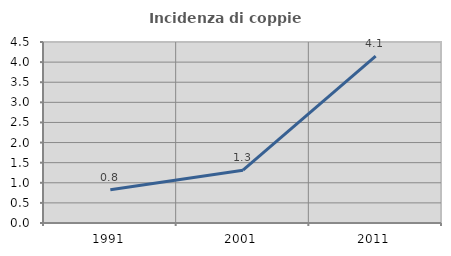
| Category | Incidenza di coppie miste |
|---|---|
| 1991.0 | 0.829 |
| 2001.0 | 1.312 |
| 2011.0 | 4.148 |